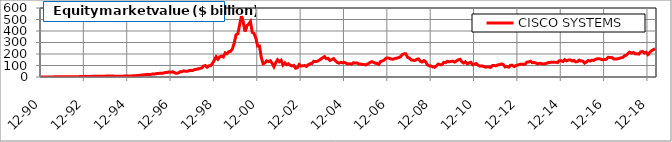
| Category | CISCO SYSTEMS |
|---|---|
| 1990-12-31 | 0.631 |
| 1991-01-31 | 0.801 |
| 1991-02-28 | 0.766 |
| 1991-03-29 | 0.672 |
| 1991-04-30 | 0.821 |
| 1991-05-31 | 0.89 |
| 1991-06-28 | 0.849 |
| 1991-07-31 | 1.093 |
| 1991-08-30 | 1.263 |
| 1991-09-30 | 1.141 |
| 1991-10-31 | 1.39 |
| 1991-11-29 | 1.412 |
| 1991-12-31 | 1.927 |
| 1992-01-31 | 2.186 |
| 1992-02-28 | 2.371 |
| 1992-03-31 | 2.343 |
| 1992-04-30 | 2.165 |
| 1992-05-29 | 2.713 |
| 1992-06-30 | 2.787 |
| 1992-07-31 | 3.165 |
| 1992-08-31 | 2.78 |
| 1992-09-30 | 3.154 |
| 1992-10-30 | 3.607 |
| 1992-11-30 | 4.493 |
| 1992-12-31 | 4.791 |
| 1993-01-29 | 5.393 |
| 1993-02-26 | 5.347 |
| 1993-03-31 | 5.454 |
| 1993-04-30 | 5.027 |
| 1993-05-31 | 6.62 |
| 1993-06-30 | 6.712 |
| 1993-07-30 | 6.36 |
| 1993-08-31 | 5.854 |
| 1993-09-30 | 6.171 |
| 1993-10-29 | 6.34 |
| 1993-11-30 | 6.959 |
| 1993-12-31 | 7.995 |
| 1994-01-31 | 8.969 |
| 1994-02-28 | 9.342 |
| 1994-03-31 | 8.677 |
| 1994-04-29 | 7.76 |
| 1994-05-31 | 6.336 |
| 1994-06-30 | 5.984 |
| 1994-07-29 | 5.404 |
| 1994-08-31 | 6.489 |
| 1994-09-30 | 7.16 |
| 1994-10-31 | 7.763 |
| 1994-11-30 | 8.311 |
| 1994-12-30 | 9.052 |
| 1995-01-31 | 8.73 |
| 1995-02-28 | 8.828 |
| 1995-03-31 | 10.243 |
| 1995-04-28 | 10.713 |
| 1995-05-31 | 11.754 |
| 1995-06-30 | 13.719 |
| 1995-07-31 | 15.126 |
| 1995-08-31 | 17.806 |
| 1995-09-29 | 18.722 |
| 1995-10-31 | 21.099 |
| 1995-11-30 | 23.02 |
| 1995-12-29 | 20.42 |
| 1996-01-31 | 22.998 |
| 1996-02-29 | 26.244 |
| 1996-03-29 | 26.225 |
| 1996-04-30 | 29.335 |
| 1996-05-31 | 31.125 |
| 1996-06-28 | 32.191 |
| 1996-07-31 | 33.222 |
| 1996-08-30 | 34.144 |
| 1996-09-30 | 40.171 |
| 1996-10-31 | 40.174 |
| 1996-11-29 | 44.07 |
| 1996-12-31 | 41.311 |
| 1997-01-31 | 45.855 |
| 1997-02-28 | 36.569 |
| 1997-03-31 | 31.938 |
| 1997-04-30 | 34.344 |
| 1997-05-30 | 44.962 |
| 1997-06-30 | 44.913 |
| 1997-07-31 | 53.235 |
| 1997-08-29 | 50.433 |
| 1997-09-30 | 49.107 |
| 1997-10-31 | 55.135 |
| 1997-11-28 | 57.97 |
| 1997-12-31 | 56.568 |
| 1998-01-30 | 63.988 |
| 1998-02-27 | 66.842 |
| 1998-03-31 | 69.947 |
| 1998-04-30 | 74.934 |
| 1998-05-29 | 77.363 |
| 1998-06-30 | 95.427 |
| 1998-07-31 | 99.25 |
| 1998-08-31 | 84.867 |
| 1998-09-30 | 97.001 |
| 1998-10-30 | 98.865 |
| 1998-11-30 | 118.403 |
| 1998-12-31 | 146.555 |
| 1999-01-29 | 176.162 |
| 1999-02-26 | 154.45 |
| 1999-03-31 | 174.993 |
| 1999-04-30 | 182.18 |
| 1999-05-31 | 174.094 |
| 1999-06-30 | 209.488 |
| 1999-07-30 | 201.97 |
| 1999-08-31 | 220.461 |
| 1999-09-30 | 222.899 |
| 1999-10-29 | 244.016 |
| 1999-11-30 | 294.097 |
| 1999-12-31 | 366.498 |
| 2000-01-31 | 374.624 |
| 2000-02-29 | 452.242 |
| 2000-03-31 | 529.005 |
| 2000-04-28 | 474.373 |
| 2000-05-31 | 396.065 |
| 2000-06-30 | 446.454 |
| 2000-07-31 | 459.623 |
| 2000-08-31 | 482.012 |
| 2000-09-29 | 388.068 |
| 2000-10-31 | 378.41 |
| 2000-11-30 | 336.267 |
| 2000-12-29 | 268.662 |
| 2001-01-31 | 269.443 |
| 2001-02-28 | 170.482 |
| 2001-03-30 | 115.058 |
| 2001-04-30 | 123.553 |
| 2001-05-31 | 140.143 |
| 2001-06-29 | 133.205 |
| 2001-07-31 | 140.67 |
| 2001-08-31 | 119.519 |
| 2001-09-28 | 89.328 |
| 2001-10-31 | 124.092 |
| 2001-11-30 | 149.925 |
| 2001-12-31 | 132.835 |
| 2002-01-31 | 145.231 |
| 2002-02-28 | 104.478 |
| 2002-03-29 | 123.953 |
| 2002-04-30 | 107.26 |
| 2002-05-31 | 115.456 |
| 2002-06-28 | 102.066 |
| 2002-07-31 | 96.506 |
| 2002-08-30 | 100.691 |
| 2002-09-30 | 76.356 |
| 2002-10-31 | 81.456 |
| 2002-11-29 | 108.706 |
| 2002-12-31 | 95.445 |
| 2003-01-31 | 97.412 |
| 2003-02-28 | 99.424 |
| 2003-03-31 | 92.312 |
| 2003-04-30 | 106.678 |
| 2003-05-30 | 115.177 |
| 2003-06-30 | 117.845 |
| 2003-07-31 | 136.795 |
| 2003-08-29 | 134.339 |
| 2003-09-30 | 136.108 |
| 2003-10-31 | 145.418 |
| 2003-11-28 | 156.706 |
| 2003-12-31 | 167.268 |
| 2004-01-30 | 177.485 |
| 2004-02-27 | 159.173 |
| 2004-03-31 | 161.991 |
| 2004-04-30 | 143.709 |
| 2004-05-31 | 151.254 |
| 2004-06-30 | 160.247 |
| 2004-07-30 | 141.45 |
| 2004-08-31 | 126.845 |
| 2004-09-30 | 120.373 |
| 2004-10-29 | 127.795 |
| 2004-11-30 | 123.464 |
| 2004-12-31 | 127.217 |
| 2005-01-31 | 118.789 |
| 2005-02-28 | 112.602 |
| 2005-03-31 | 115.64 |
| 2005-04-29 | 111.632 |
| 2005-05-31 | 123.979 |
| 2005-06-30 | 121.934 |
| 2005-07-29 | 122.381 |
| 2005-08-31 | 112.604 |
| 2005-09-30 | 112.443 |
| 2005-10-31 | 109.493 |
| 2005-11-30 | 107.74 |
| 2005-12-30 | 105.16 |
| 2006-01-31 | 114.067 |
| 2006-02-28 | 124.487 |
| 2006-03-31 | 133.283 |
| 2006-04-28 | 128.854 |
| 2006-05-31 | 120.139 |
| 2006-06-30 | 119.223 |
| 2006-07-31 | 109.151 |
| 2006-08-31 | 134.24 |
| 2006-09-29 | 139.491 |
| 2006-10-31 | 146.472 |
| 2006-11-30 | 163.417 |
| 2006-12-29 | 165.967 |
| 2007-01-31 | 161.656 |
| 2007-02-28 | 156.678 |
| 2007-03-30 | 154.202 |
| 2007-04-30 | 161.51 |
| 2007-05-31 | 163.438 |
| 2007-06-29 | 169.084 |
| 2007-07-31 | 175.52 |
| 2007-08-31 | 193.794 |
| 2007-09-28 | 201.79 |
| 2007-10-31 | 201.364 |
| 2007-11-30 | 169.996 |
| 2007-12-31 | 164.232 |
| 2008-01-31 | 148.641 |
| 2008-02-29 | 145.389 |
| 2008-03-31 | 143.6 |
| 2008-04-30 | 152.84 |
| 2008-05-30 | 157.839 |
| 2008-06-30 | 137.4 |
| 2008-07-31 | 129.898 |
| 2008-08-29 | 142.066 |
| 2008-09-30 | 132.721 |
| 2008-10-31 | 104.541 |
| 2008-11-28 | 96.843 |
| 2008-12-31 | 95.438 |
| 2009-01-30 | 87.651 |
| 2009-02-27 | 85.045 |
| 2009-03-31 | 97.887 |
| 2009-04-30 | 112.771 |
| 2009-05-29 | 106.706 |
| 2009-06-30 | 107.571 |
| 2009-07-31 | 126.951 |
| 2009-08-31 | 124.586 |
| 2009-09-30 | 136.282 |
| 2009-10-30 | 132.055 |
| 2009-11-30 | 134.61 |
| 2009-12-31 | 137.717 |
| 2010-01-29 | 129.26 |
| 2010-02-26 | 139.305 |
| 2010-03-31 | 149.038 |
| 2010-04-30 | 154.191 |
| 2010-05-31 | 132.27 |
| 2010-06-30 | 121.705 |
| 2010-07-30 | 131.756 |
| 2010-08-31 | 114.137 |
| 2010-09-30 | 122.31 |
| 2010-10-29 | 127.671 |
| 2010-11-30 | 106.199 |
| 2010-12-31 | 112.13 |
| 2011-01-31 | 117.229 |
| 2011-02-28 | 102.6 |
| 2011-03-31 | 94.805 |
| 2011-04-29 | 96.85 |
| 2011-05-31 | 92.403 |
| 2011-06-30 | 85.858 |
| 2011-07-29 | 87.838 |
| 2011-08-31 | 86.188 |
| 2011-09-30 | 83.434 |
| 2011-10-31 | 99.413 |
| 2011-11-30 | 100.206 |
| 2011-12-30 | 97.195 |
| 2012-01-31 | 105.609 |
| 2012-02-29 | 107.072 |
| 2012-03-30 | 113.912 |
| 2012-04-30 | 108.554 |
| 2012-05-31 | 87.478 |
| 2012-06-29 | 91.978 |
| 2012-07-31 | 85.442 |
| 2012-08-31 | 102.209 |
| 2012-09-28 | 101.25 |
| 2012-10-31 | 90.91 |
| 2012-11-30 | 100.398 |
| 2012-12-31 | 104.324 |
| 2013-01-31 | 109.211 |
| 2013-02-28 | 111.198 |
| 2013-03-29 | 111.411 |
| 2013-04-30 | 111.545 |
| 2013-05-31 | 128.879 |
| 2013-06-28 | 130.054 |
| 2013-07-31 | 136.762 |
| 2013-08-30 | 124.576 |
| 2013-09-30 | 126.163 |
| 2013-10-31 | 121.473 |
| 2013-11-30 | 113.616 |
| 2013-12-31 | 119.924 |
| 2014-01-31 | 117.144 |
| 2014-02-28 | 112.298 |
| 2014-03-31 | 115.466 |
| 2014-04-30 | 119.046 |
| 2014-05-31 | 126.12 |
| 2014-06-30 | 127.299 |
| 2014-07-31 | 129.245 |
| 2014-08-31 | 128.016 |
| 2014-09-30 | 128.873 |
| 2014-10-31 | 125.289 |
| 2014-11-30 | 141.34 |
| 2014-12-31 | 142.234 |
| 2015-01-30 | 134.82 |
| 2015-02-27 | 150.641 |
| 2015-03-31 | 140.508 |
| 2015-04-30 | 147.17 |
| 2015-05-29 | 149.067 |
| 2015-06-30 | 139.658 |
| 2015-07-31 | 144.541 |
| 2015-08-31 | 131.623 |
| 2015-09-30 | 133.538 |
| 2015-10-30 | 146.764 |
| 2015-11-30 | 138.323 |
| 2015-12-31 | 137.841 |
| 2016-01-29 | 120.76 |
| 2016-02-29 | 131.741 |
| 2016-03-31 | 143.264 |
| 2016-04-29 | 138.333 |
| 2016-05-31 | 146.113 |
| 2016-06-30 | 144.302 |
| 2016-07-29 | 153.557 |
| 2016-08-31 | 158.134 |
| 2016-09-30 | 159.055 |
| 2016-10-31 | 154.206 |
| 2016-11-30 | 149.689 |
| 2016-12-30 | 151.697 |
| 2017-01-31 | 154.207 |
| 2017-02-28 | 171.168 |
| 2017-03-31 | 169.266 |
| 2017-04-28 | 170.618 |
| 2017-05-31 | 157.652 |
| 2017-06-30 | 156.502 |
| 2017-07-31 | 157.252 |
| 2017-08-31 | 161.052 |
| 2017-09-29 | 166.534 |
| 2017-10-31 | 169.103 |
| 2017-11-30 | 184.397 |
| 2017-12-29 | 189.341 |
| 2018-01-31 | 205.358 |
| 2018-02-28 | 215.728 |
| 2018-03-30 | 206.623 |
| 2018-04-30 | 213.368 |
| 2018-05-31 | 200.86 |
| 2018-06-29 | 202.365 |
| 2018-07-31 | 198.885 |
| 2018-08-31 | 218.373 |
| 2018-09-28 | 222.395 |
| 2018-10-31 | 209.138 |
| 2018-11-30 | 215.222 |
| 2018-12-31 | 194.81 |
| 2019-01-31 | 212.614 |
| 2019-02-28 | 227.893 |
| 2019-03-29 | 237.665 |
| 2019-04-30 | 246.293 |